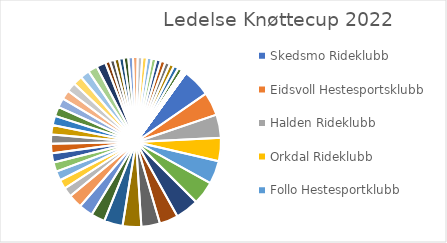
| Category | Series 0 |
|---|---|
| Skedsmo Rideklubb | 7 |
| Eidsvoll Hestesportsklubb | 5 |
| Halden Rideklubb | 5 |
| Orkdal Rideklubb | 5 |
| Follo Hestesportklubb | 5 |
| Selbu Hestesportsklubb | 5 |
| Verdal Og Omegn Rideklubb | 5 |
| Asker Rideklubb | 4 |
| Søndre Aas Gård kjøre- og rideklubb | 4 |
| Konglungen Rideklubb | 4 |
| Tomter Rideklubb | 4 |
| Hasle Hestesportsklubb | 3 |
| Øvre Romerike Rideklubb | 3 |
| Ekeberg Rideklubb | 3 |
| Arendal og Grimstad rideklubb | 2 |
| Blakstad Hestesportklubb | 2 |
| Haugesund Rideklubb | 2 |
| Indre Haugaland Ryttersportklubb | 2 |
| Mastra Hestesportsklubb | 2 |
| Oslo og Akershus Fjordhestlag | 2 |
| Randaberg Ryttersportsklubb | 2 |
| Skeyna Kjøre- og Rideklubb | 2 |
| Solør Rideklubb | 2 |
| Sunnfjord Hestesportklubb | 2 |
| Sørum Hestesportsklubb | 2 |
| Tveit Feltrittsklubb | 2 |
| Ytre Rideklubb | 2 |
| Åsane Rideklubb | 2 |
| Skånland Stall og Rideklubb | 2 |
| Austrått Hestesportsklubb | 2 |
| Namsos Kjøre- og Rideklubb | 2 |
| Blakstad Rideklubb | 1 |
| Brekka Rideklubb | 1 |
| Bryne Hestesportsklubb | 1 |
| Dikemark Rideklubb | 1 |
| Gjøvik Rideklubb | 1 |
| Hammerfest Rideklubb | 1 |
| Holmestrand og Omegn Rideklubb | 1 |
| Jæren Kjøre & Rideklubb | 1 |
| Lommedalen Kjøre Og Rideklubb | 1 |
| Nittedal Rideklubb | 1 |
| Rosendal Rideklubb | 1 |
| Sylling Rideklubb | 1 |
| Søndre Eikeberg Rideklubb | 1 |
| Vestre Bærum Rideklubb | 1 |
| Østmarka Rytterklubb | 1 |
| Rakkestad Kjøre og Rideklubb | 1 |
| Stovner Rideklubb | 1 |
| Alta Rideklubb | 0 |
| Alver rideklubb | 0 |
| Alvøen Rideklubb | 0 |
| Andøy Rideklubb | 0 |
| Angvik Idrettslag | 0 |
| Arvakur Islandshestforening | 0 |
| Askim Rideklubb | 0 |
| Askur Islandshestforening | 0 |
| Atlungstad Rideklubb | 0 |
| Aurskog-Høland Rideklubb | 0 |
| Austerli-Bjugn Hestesportsklubb | 0 |
| Austevoll Rideklubb | 0 |
| Baldur Islandshestforening | 0 |
| Bergen Nord Ride og Kjøreklubb | 0 |
| Bergen Rideklubb | 0 |
| Biri Hestesportklubb | 0 |
| Bjerkreim Hestalag | 0 |
| Bjørgvin Dressurklubb | 0 |
| Bodø Ride- og kjøreklubb | 0 |
| Borge Rideklubb  | 0 |
| Brunlanes og Stavern Rideklubb - Ridning | 0 |
| Bruråk Hestesportsklubb | 0 |
| Brønnøy Hestesportsklubb | 0 |
| Bykle og Hovden Rideklubb | 0 |
| Bærum Rideklubb | 0 |
| Bømlo Hestesportsklubb | 0 |
| Båtsfjord Sportsklubb | 0 |
| De Norske Officerers Rideklub | 0 |
| Drammen Og Omegn Rideklubb | 0 |
| Drammen Ryttersportsklubb | 0 |
| Drøbak Rideklubb | 0 |
| Egersund Og Dalane Rideklubb | 0 |
| Eid Ride Og Køyreklubb | 0 |
| Eidsberg Rideklubb | 0 |
| Eidskog Ride og Kjøreklubb | 0 |
| Eiker Ride- og Kjøreklubb | 0 |
| Ellingsrud Rytterklubb | 0 |
| Elveli Kjøre- og Rideklubb | 0 |
| Elverum Rideklubb | 0 |
| Epona Rideklubb | 0 |
| Fakur Islandshestforening | 0 |
| Fana Hestesportsklubb | 0 |
| Fauske Kjøre- og Rideklubb | 0 |
| Faxi Islandshestforening | 0 |
| Fengur Islandshestforening | 0 |
| Findal Kjøre og Rideklubb | 0 |
| Finneidfjord IL | 0 |
| Fjelldal IL | 0 |
| Flora Hestesportklubb | 0 |
| Fortuna Rideklubb | 0 |
| Fredrikstad og Omegn Rideklubb | 0 |
| Freyfaxi Islandshestklubb | 0 |
| Friheten Rideklubb Sandnes | 0 |
| Frisk Rideklubb | 0 |
| Froland Rideklubb | 0 |
| Fron Ride- og kjøreklubb | 0 |
| Fræna Rideklubb | 0 |
| Fusa Hestesportlag | 0 |
| Førde Køyre Og Rideklubb | 0 |
| Gandur Islandshestforening | 0 |
| Geilo Ride- og Kjøreklubb | 0 |
| Gevelt Ryttersportsklubb | 0 |
| Gimle Rytterforening | 0 |
| Giske Hestesportsklubb | 0 |
| Gjerdrum Hestesportsklubb | 0 |
| Gladur- Ridning | 0 |
| Gloi Islandshestforening | 0 |
| Gloppen Køyre- og Rideklubb - Ridning | 0 |
| Grenland Ryttersportsklubb | 0 |
| Grong Hestesportsklubb | 0 |
| Gustur Islandshestlag | 0 |
| Gyland Hestesportlag | 0 |
| Gylder Rideklubb | 0 |
| Hadeland Ride Og Kjøreklubb | 0 |
| Hallingen Hestesportsklubb | 0 |
| Hardanger hestalag - Riding | 0 |
| Hareid Ride og Køyreklubb | 0 |
| Harstad Ride og Kjøreklubb | 0 |
| Harstad Rytterklubb | 0 |
| Hedemarken Rideklubb | 0 |
| Hekla Islandshestforening | 0 |
| Hemne Hestesportklubb | 0 |
| Hestesportlaget MIKS | 0 |
| Hlynur Islandshestforening | 0 |
| Hof Rideklubb | 0 |
| Holand Hestesportsklubb | 0 |
| Hrani Islandshestforening | 0 |
| Hrappur Islandshestklubb | 0 |
| HRIMFAXI | 0 |
| Hrimnir | 0 |
| Hugljufur Islandshestforening | 0 |
| Hurdal Hestesportklubb | 0 |
| Hurum Rideklubb | 0 |
| Hønefoss Og Ringerike Rideklubb | 0 |
| Hørdur Midt Telem.Islandshestl | 0 |
| Høvdingen,IL | 0 |
| Håkvik Ride- og Kjøreklubb | 0 |
| Hålogalandkuskene hestesportklubb | 0 |
| Indre Hardanger Rideklubb | 0 |
| Isafold Islandshestforening | 0 |
| Isafold Islandshestforening - gr. | 0 |
| Islandshestklubben Vikingur | 0 |
| Jarlsberg og Melsom Rideklubb | 0 |
| Jotunheimen Hestelag | 0 |
| Jøkul Islandshestforening | 0 |
| Karasjok Kjøre- og Rideklubb | 0 |
| Karmøy Rideklubb | 0 |
| Kirkenes Ryttersportsklubb | 0 |
| Kjøre og ridekl Sleipnir | 0 |
| Kongsberg Og Omegn Rideklub | 0 |
| Kongsvinger Og Omegn Ridekl. | 0 |
| Kragerø Rideklubb | 0 |
| Kristiansand og Søgne Ridekl. | 0 |
| Kristiansand Ryttersport Klubb | 0 |
| Kristiansund og Frei Hestesportsklubb | 0 |
| Kvaløya & Omegn Hestesportsklubb | 0 |
| Kvinesdal Rideklubb | 0 |
| Kvinnherad Hesteskysslag | 0 |
| Kvænangen Rideklubb | 0 |
| Langesund Rideklubb | 0 |
| Langøya Rideklubb | 0 |
| Lardal Hesteforening | 0 |
| Larvik og Sandefjord Rytterklubb | 0 |
| Lesja og Dovre Hestesportsklubb | 0 |
| Levanger og Innherred Hestesportsklubb | 0 |
| Lillehammer Rideklubb | 0 |
| Lista Ride- og kjøreklubb | 0 |
| Lister Hest og Ponni Klubb | 0 |
| Lofoten Hestesportsklubb | 0 |
| Lund Kjøre- og Rideklubb | 0 |
| Lyngen Hesteforening | 0 |
| Lysefjorden rideklubb | 0 |
| Lærdal Ride- og Køyreklubb | 0 |
| Lø Hestesportsklubb, Steinkjer | 0 |
| Løten Ride og Kjøreklubb | 0 |
| Majorplassen Ryttersportsklubb | 0 |
| Malvik Rideklubb | 0 |
| Marker Kjøre- og Rideklubb | 0 |
| Marnardal Kjøre- og Rideklubb | 0 |
| Melhus Hestesportsklubb | 0 |
| Meløy Hestesportslag | 0 |
| Midt Gudbrandsdal Ride Og Kjøreklubb | 0 |
| Midt-Troms og omegn hestesportsklubb | 0 |
| Molde Hestesportsklubb  | 0 |
| Molde Rytterklubb | 0 |
| Moldegaard Ryttersportsklubb | 0 |
| Morger Rideklubb | 0 |
| Morsdalen Rideklubb | 0 |
| Mosjøen Kjøre- og Rideklubb | 0 |
| Moss og Omegn Hestesportklubb | 0 |
| Nannestad Hestesportklubb | 0 |
| Narvik Ryttersportsklubb | 0 |
| Naustdal Køyre- og Rideklubb | 0 |
| Nedre Romerike Ryttersportsklubb | 0 |
| Nedre Setesdal Rideklubb | 0 |
| Nes Rideklubb | 0 |
| Nesodden Rideklubb | 0 |
| Nitusen-byen Hestesportsklubb | 0 |
| Nome Rideklubb | 0 |
| Nordhordland Hestesportklubb | 0 |
| Nord-Karmøy Rideklubb | 0 |
| Nordlys hestesportsklubb | 0 |
| Nordmarka Ryttersportsklubb - Ridning | 0 |
| Nordre Land IL | 0 |
| Nordreisa Rideklubb | 0 |
| Nord-Salten Hestesportklubb | 0 |
| Nordtvet Rideklubb | 0 |
| Nordvest Hestesportklubb | 0 |
| Nord-Østerdal Hestesportsklubb | 0 |
| Notodden Ryttersportsklubb | 0 |
| NTNUI | 0 |
| Nærbø Rideklubb | 0 |
| Okstindan Hestesportsklubb | 0 |
| Oppdal Hestesportsklubb | 0 |
| Orkland Hestesportsklubb | 0 |
| Oslo Politis IL | 0 |
| Oslo Ryttersportsklubb | 0 |
| Osmarka Hestesportklubb | 0 |
| Osterøy Fjordhestlag | 0 |
| Polarsirkelen Hestesportklubb | 0 |
| Porsanger Rideklubb | 0 |
| Radøy Hestesportklubb | 0 |
| Rauma Hestesportsklubb | 0 |
| Riska Rideklubb | 0 |
| Risør Ride og Kjøreklubb - Ridning | 0 |
| Rjukan og Omegn Rideklubb | 0 |
| Rogaland Rideklubb | 0 |
| Rosseland Ryttersportklubb | 0 |
| Ryttersportklubben NOR | 0 |
| Rælingen Rideklubb | 0 |
| Røkkvi Islandshestklubb | 0 |
| Røros og omegn hestesportsklubb | 0 |
| Råde og Onsøy Rideklubb | 0 |
| SAGA ISLANDSHESTLAG | 0 |
| Sagvåg/Litlabø Rideklubb | 0 |
| Salten Hestesportsklubb | 0 |
| Sandnes Og Jæren Rideklubb | 0 |
| Sandsvær Ryttersportsklubb | 0 |
| Sarpsborg Og Omegn Rideklubb | 0 |
| Sekken Hestesportklubb | 0 |
| Seljord Idrettslag | 0 |
| Senja hestesportsklubb | 0 |
| Sigdal og Rosthaug Hestesportlag | 0 |
| Skeivoll Ride- og Kjøreklubb | 0 |
| Ski Rideklubb | 0 |
| Skien Rideklubb | 0 |
| Skinfakse Rytterklubb | 0 |
| Skjomen IL | 0 |
| Skjåk Hestelag | 0 |
| Skogan Rideklubb | 0 |
| Skudenes Rytterklubb | 0 |
| Skuterud Rideklubb | 0 |
| Skåra Rideklubb | 0 |
| Sletten Kjøre- og rideklubb | 0 |
| Smøla  Rideklubb | 0 |
| Sogndal Køyre- Og Rideklubb | 0 |
| Solberg Rytterklubb | 0 |
| Soma Ryttersportsklubb | 0 |
| Sotra Rideklubb | 0 |
| Spydeberg Rideklubb | 0 |
| Stall-C Hestesportsklubb | 0 |
| Starum Hestesportsklubb | 0 |
| Stauslandstunet Rideklubb | 0 |
| Stav Kjøre og Rideklubb | 0 |
| Stavanger og Sola Rytterklubb | 0 |
| Steinkjer Rideklubb | 0 |
| Steinseth Rideklubb | 0 |
| Stend og Midthordland Hestesportslag | 0 |
| Stjørdal Rideklubb | 0 |
| Stord Hestesportlag | 0 |
| Storfjord Kjøre-og Rideklubb | 0 |
| Storhaug Rideklubb - ridning | 0 |
| Stormur Islandshestforening | 0 |
| Strand Hestesportklubb | 0 |
| Stranda Ride og Køyreklubb | 0 |
| Sula Rideklubb | 0 |
| Sunna Islandshestforening | 0 |
| Sunndal Rideklubb | 0 |
| Svelvik Ride- og Kjøreklubb | 0 |
| Sykkylven Rideklubb | 0 |
| Syv Søstre Hestesportsklubb | 0 |
| Sætregården Hestesportsklubb | 0 |
| Søndre Nordstrand Rideklubb | 0 |
| Sørkedalen Rideklubb Oslo | 0 |
| Sørlandsparken Rideklubb | 0 |
| Sør-Varanger Rideforening | 0 |
| Tana Hestesportsklubb | 0 |
| Tangen Kjøre- Og Rideklubb | 0 |
| Tanum rideklubb | 0 |
| Tefre Ryttarklubb | 0 |
| Telemark Fjordhestlag | 0 |
| Tjernagel Rideklubb | 0 |
| Trollheimen ride- og kjørelag | 0 |
| Tromsdalen Rideklubb | 0 |
| Tromsø Ryttersportsklubb | 0 |
| Trondheim Rideklubb | 0 |
| Trøndelag Hestesportsklubb | 0 |
| Tysnes Hestesportslag | 0 |
| Tønsberg og Omegn Rideklubb | 0 |
| Ullensaker Rideklubb | 0 |
| Utskarpen IL - Hestesport | 0 |
| Vadsø Hestesportsklubb | 0 |
| Valdres Ride- og Kjøreklubb | 0 |
| Valle Rideklubb | 0 |
| Varanger Rideklubb  | 0 |
| Vardø og omegn Ryttersportsklubb | 0 |
| Vefsn Hestesportklubb | 0 |
| Vennesla Rytterforening | 0 |
| Vestby Hesteklubb | 0 |
| Vesterålen Hestesportsklubb | 0 |
| Vestnes Islandshestforening - Ridning | 0 |
| Vestri Islandshestforening | 0 |
| Viba Rideklubb | 0 |
| Vidir Islandshestklubb | 0 |
| Vik Ride- og Køyreklubb | 0 |
| Villingur Islandshest forening | 0 |
| Volda Rideklubb | 0 |
| Voss Køyre-og Rideklubb | 0 |
| Vaadan Hestesportklubb - Ridning | 0 |
| Ytre Nordfjord ride og kjøreklubb | 0 |
| Ørskog Ride- og Køyreklubb - Ridning | 0 |
| Ørsta Ride- og Køyreklubb | 0 |
| Øvre Vang Ride og Kjøreklubb | 0 |
| Øystese Ride- og køyreklubb | 0 |
| Ålesund Rideklubb | 0 |